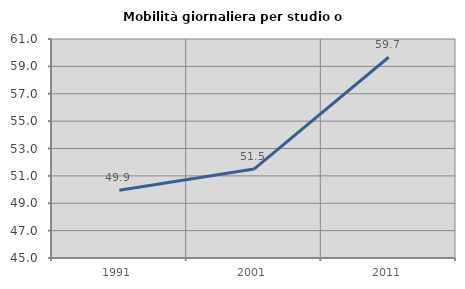
| Category | Mobilità giornaliera per studio o lavoro |
|---|---|
| 1991.0 | 49.947 |
| 2001.0 | 51.498 |
| 2011.0 | 59.667 |